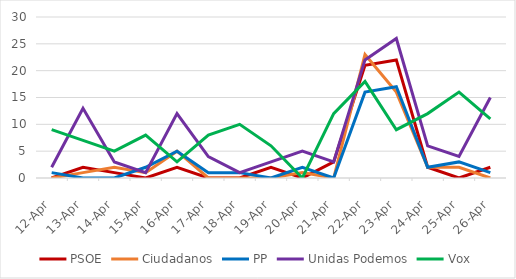
| Category | PSOE | Ciudadanos | PP | Unidas Podemos | Vox |
|---|---|---|---|---|---|
| 2019-04-12 | 0 | 0 | 1 | 2 | 9 |
| 2019-04-13 | 2 | 1 | 0 | 13 | 7 |
| 2019-04-14 | 1 | 2 | 0 | 3 | 5 |
| 2019-04-15 | 0 | 1 | 2 | 1 | 8 |
| 2019-04-16 | 2 | 5 | 5 | 12 | 3 |
| 2019-04-17 | 0 | 0 | 1 | 4 | 8 |
| 2019-04-18 | 0 | 0 | 1 | 1 | 10 |
| 2019-04-19 | 2 | 0 | 0 | 3 | 6 |
| 2019-04-20 | 0 | 1 | 2 | 5 | 0 |
| 2019-04-21 | 3 | 0 | 0 | 3 | 12 |
| 2019-04-22 | 21 | 23 | 16 | 22 | 18 |
| 2019-04-23 | 22 | 16 | 17 | 26 | 9 |
| 2019-04-24 | 2 | 2 | 2 | 6 | 12 |
| 2019-04-25 | 0 | 2 | 3 | 4 | 16 |
| 2019-04-26 | 2 | 0 | 1 | 15 | 11 |